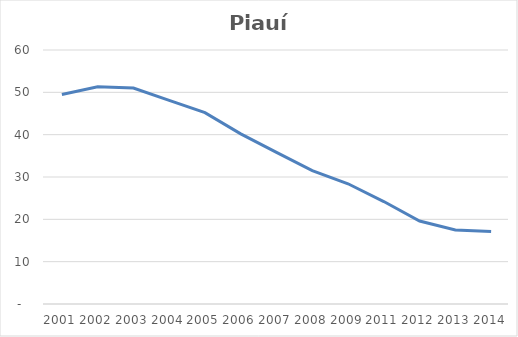
| Category | Total |
|---|---|
| 2001.0 | 49.5 |
| 2002.0 | 51.3 |
| 2003.0 | 51 |
| 2004.0 | 48.1 |
| 2005.0 | 45.2 |
| 2006.0 | 40.2 |
| 2007.0 | 35.8 |
| 2008.0 | 31.5 |
| 2009.0 | 28.4 |
| 2011.0 | 24.2 |
| 2012.0 | 19.6 |
| 2013.0 | 17.5 |
| 2014.0 | 17.1 |